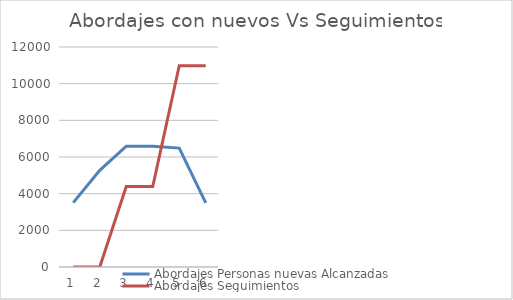
| Category | Abordajes Personas nuevas Alcanzadas | Abordajes Seguimientos |
|---|---|---|
| 0 | 3512.52 | 0 |
| 1 | 5268.78 | 0 |
| 2 | 6585.975 | 4390.65 |
| 3 | 6585.975 | 4390.65 |
| 4 | 6486.188 | 10976.625 |
| 5 | 3492.562 | 10976.625 |